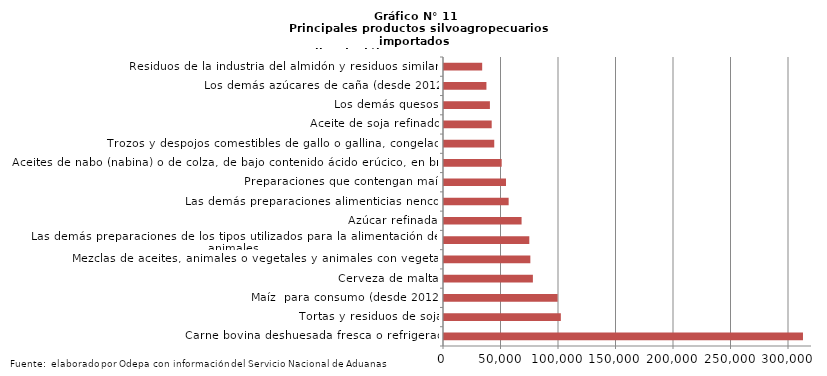
| Category | Series 0 |
|---|---|
| Carne bovina deshuesada fresca o refrigerada | 312154.852 |
| Tortas y residuos de soja | 101606.499 |
| Maíz  para consumo (desde 2012) | 98775.224 |
| Cerveza de malta | 77294.74 |
| Mezclas de aceites, animales o vegetales y animales con vegetales | 75087.351 |
| Las demás preparaciones de los tipos utilizados para la alimentación de los animales | 74178.205 |
| Azúcar refinada | 67460.082 |
| Las demás preparaciones alimenticias nencop | 56214.025 |
| Preparaciones que contengan maíz | 53918.975 |
| Aceites de nabo (nabina) o de colza, de bajo contenido ácido erúcico, en bruto | 50170.696 |
| Trozos y despojos comestibles de gallo o gallina, congelados | 43689.12 |
| Aceite de soja refinado | 41474.35 |
| Los demás quesos | 39921.666 |
| Los demás azúcares de caña (desde 2012) | 36892.508 |
| Residuos de la industria del almidón y residuos similares | 33200.784 |